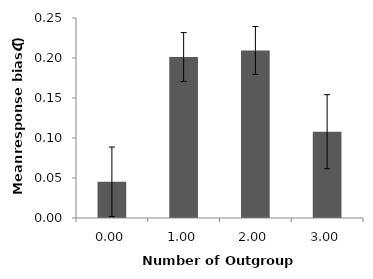
| Category | Number of Outgroup Features |
|---|---|
| 0.0 | 0.045 |
| 1.0 | 0.201 |
| 2.0 | 0.209 |
| 3.0 | 0.108 |